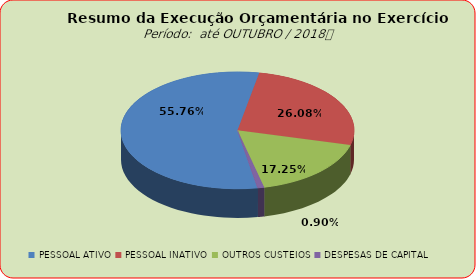
| Category | Series 0 |
|---|---|
| PESSOAL ATIVO | 123780898.27 |
| PESSOAL INATIVO | 57899491.2 |
| OUTROS CUSTEIOS | 38301630.93 |
| DESPESAS DE CAPITAL | 2001816.63 |